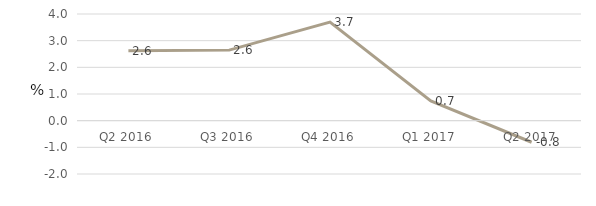
| Category | Non-Financial Corporations |
|---|---|
| Q2 2016 | 2.621 |
| Q3 2016 | 2.645 |
| Q4 2016 | 3.695 |
| Q1 2017 | 0.742 |
| Q2 2017 | -0.809 |